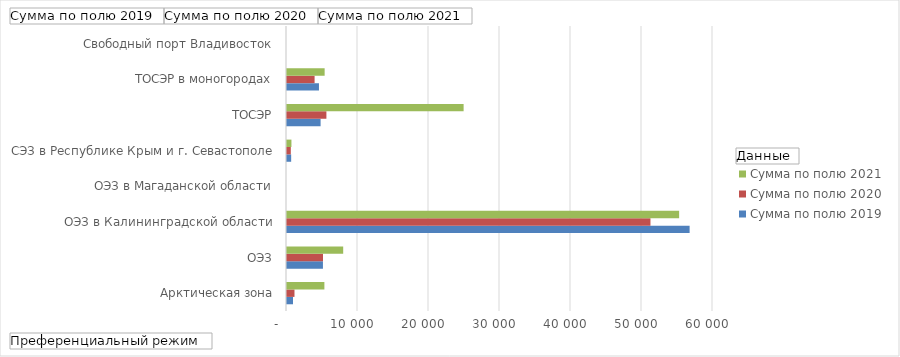
| Category | Сумма по полю 2019 | Сумма по полю 2020 | Сумма по полю 2021 |
|---|---|---|---|
| Арктическая зона | 847.25 | 1053.34 | 5266.06 |
| ОЭЗ | 5062.25 | 5070.16 | 7914.44 |
| ОЭЗ в Калининградской области | 56706.78 | 51191.57 | 55230.41 |
| ОЭЗ в Магаданской области | 0 | 0 | 0 |
| СЭЗ в Республике Крым и г. Севастополе | 586.39 | 536.55 | 624.45 |
| ТОСЭР | 4732.19 | 5549.88 | 24875.12 |
| ТОСЭР в моногородах | 4501.63 | 3885.81 | 5300.95 |
| Свободный порт Владивосток | 0 | 0 | 0 |